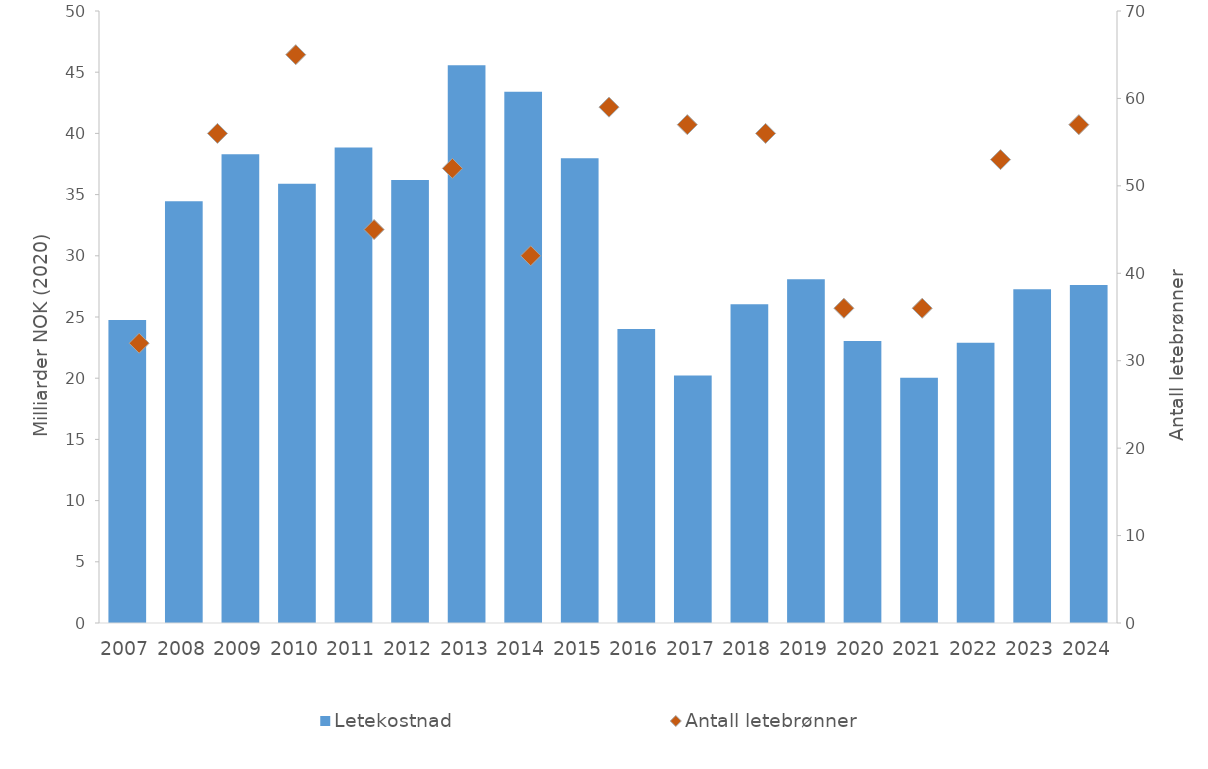
| Category | Letekostnad  |
|---|---|
| 2007.0 | 24.758 |
| 2008.0 | 34.455 |
| 2009.0 | 38.298 |
| 2010.0 | 35.891 |
| 2011.0 | 38.852 |
| 2012.0 | 36.2 |
| 2013.0 | 45.561 |
| 2014.0 | 43.412 |
| 2015.0 | 37.972 |
| 2016.0 | 24.023 |
| 2017.0 | 20.218 |
| 2018.0 | 26.052 |
| 2019.0 | 28.086 |
| 2020.0 | 23.033 |
| 2021.0 | 20.04 |
| 2022.0 | 22.902 |
| 2023.0 | 27.259 |
| 2024.0 | 27.614 |